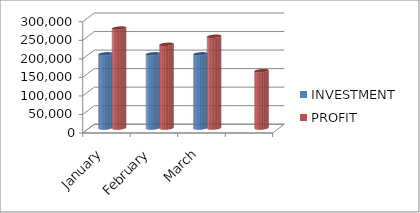
| Category | INVESTMENT  | PROFIT |
|---|---|---|
| January | 200000 | 269462 |
| February | 200000 | 225700 |
| March | 200000 | 247400 |